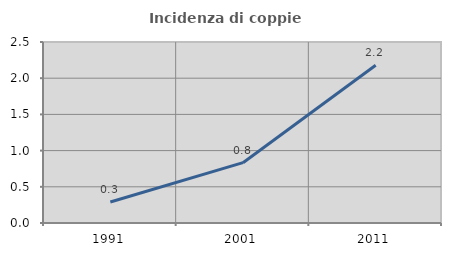
| Category | Incidenza di coppie miste |
|---|---|
| 1991.0 | 0.29 |
| 2001.0 | 0.833 |
| 2011.0 | 2.18 |